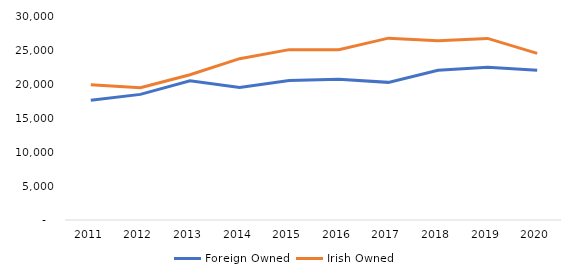
| Category | Foreign Owned | Irish Owned |
|---|---|---|
| 2011.0 | 17610 | 19894 |
| 2012.0 | 18472 | 19451 |
| 2013.0 | 20468 | 21365 |
| 2014.0 | 19477 | 23722 |
| 2015.0 | 20523 | 25054 |
| 2016.0 | 20696 | 25037 |
| 2017.0 | 20240 | 26742 |
| 2018.0 | 22019 | 26343 |
| 2019.0 | 22446 | 26705 |
| 2020.0 | 22013 | 24508 |